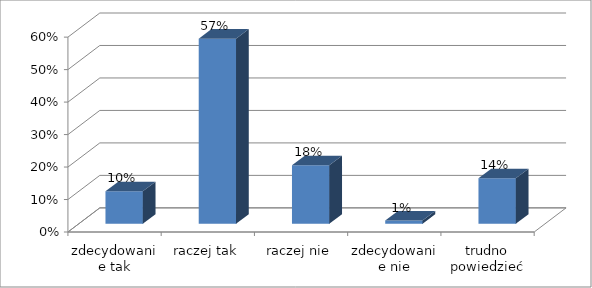
| Category | Series 0 |
|---|---|
| zdecydowanie tak | 0.1 |
| raczej tak | 0.57 |
| raczej nie | 0.18 |
| zdecydowanie nie | 0.01 |
| trudno powiedzieć | 0.14 |